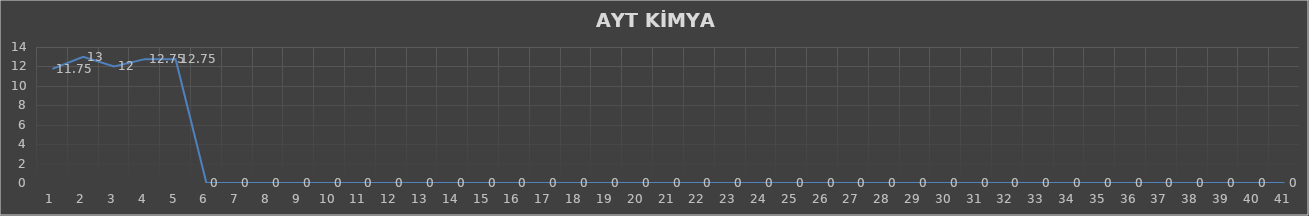
| Category | Series 0 |
|---|---|
| 0 | 11.75 |
| 1 | 13 |
| 2 | 12 |
| 3 | 12.75 |
| 4 | 12.75 |
| 5 | 0 |
| 6 | 0 |
| 7 | 0 |
| 8 | 0 |
| 9 | 0 |
| 10 | 0 |
| 11 | 0 |
| 12 | 0 |
| 13 | 0 |
| 14 | 0 |
| 15 | 0 |
| 16 | 0 |
| 17 | 0 |
| 18 | 0 |
| 19 | 0 |
| 20 | 0 |
| 21 | 0 |
| 22 | 0 |
| 23 | 0 |
| 24 | 0 |
| 25 | 0 |
| 26 | 0 |
| 27 | 0 |
| 28 | 0 |
| 29 | 0 |
| 30 | 0 |
| 31 | 0 |
| 32 | 0 |
| 33 | 0 |
| 34 | 0 |
| 35 | 0 |
| 36 | 0 |
| 37 | 0 |
| 38 | 0 |
| 39 | 0 |
| 40 | 0 |